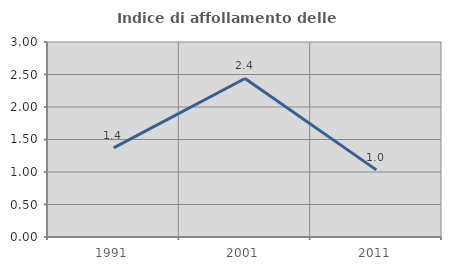
| Category | Indice di affollamento delle abitazioni  |
|---|---|
| 1991.0 | 1.372 |
| 2001.0 | 2.439 |
| 2011.0 | 1.033 |